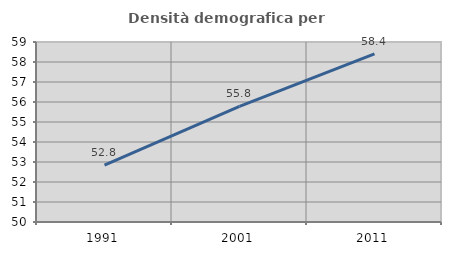
| Category | Densità demografica |
|---|---|
| 1991.0 | 52.841 |
| 2001.0 | 55.779 |
| 2011.0 | 58.402 |